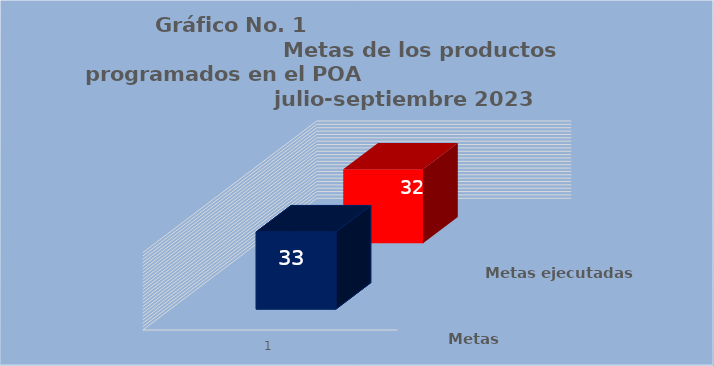
| Category | Metas programadas | Metas ejecutadas |
|---|---|---|
| 0 | 33 | 32 |